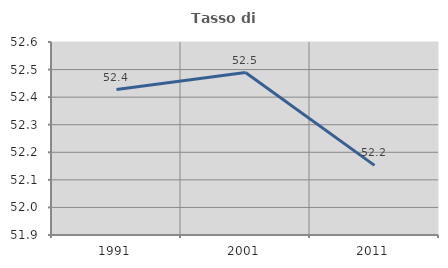
| Category | Tasso di occupazione   |
|---|---|
| 1991.0 | 52.428 |
| 2001.0 | 52.489 |
| 2011.0 | 52.153 |